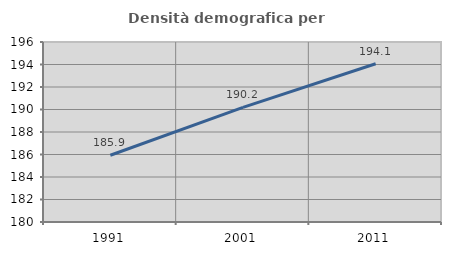
| Category | Densità demografica |
|---|---|
| 1991.0 | 185.936 |
| 2001.0 | 190.187 |
| 2011.0 | 194.065 |